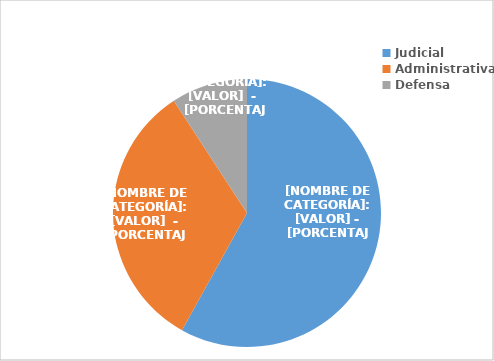
| Category | Series 0 |
|---|---|
| Judicial | 486 |
| Administrativa | 274 |
| Defensa | 77 |